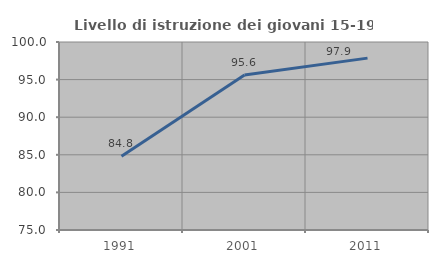
| Category | Livello di istruzione dei giovani 15-19 anni |
|---|---|
| 1991.0 | 84.81 |
| 2001.0 | 95.604 |
| 2011.0 | 97.857 |